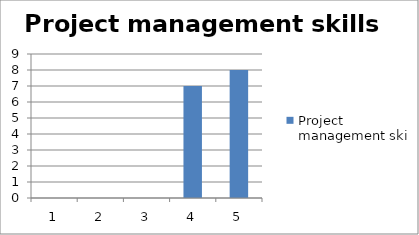
| Category | Project management skills |
|---|---|
| 0 | 0 |
| 1 | 0 |
| 2 | 0 |
| 3 | 7 |
| 4 | 8 |